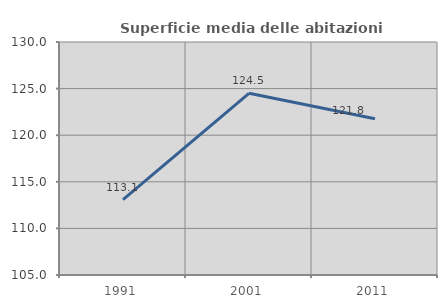
| Category | Superficie media delle abitazioni occupate |
|---|---|
| 1991.0 | 113.09 |
| 2001.0 | 124.496 |
| 2011.0 | 121.769 |